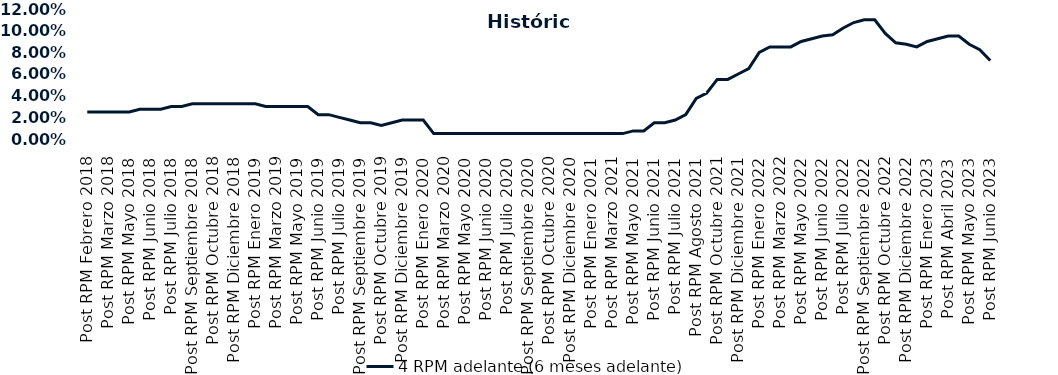
| Category | 4 RPM adelante (6 meses adelante) |
|---|---|
| Post RPM Febrero 2018 | 0.025 |
| Pre RPM Marzo 2018 | 0.025 |
| Post RPM Marzo 2018 | 0.025 |
| Pre RPM Mayo 2018 | 0.025 |
| Post RPM Mayo 2018 | 0.025 |
| Pre RPM Junio 2018 | 0.028 |
| Post RPM Junio 2018 | 0.028 |
| Pre RPM Julio 2018 | 0.028 |
| Post RPM Julio 2018 | 0.03 |
| Pre RPM Septiembre 2018 | 0.03 |
| Post RPM Septiembre 2018 | 0.032 |
| Pre RPM Octubre 2018 | 0.032 |
| Post RPM Octubre 2018 | 0.032 |
| Pre RPM Diciembre 2018 | 0.032 |
| Post RPM Diciembre 2018 | 0.032 |
| Pre RPM Enero 2019 | 0.032 |
| Post RPM Enero 2019 | 0.032 |
| Pre RPM Marzo 2019 | 0.03 |
| Post RPM Marzo 2019 | 0.03 |
| Pre RPM Mayo 2019 | 0.03 |
| Post RPM Mayo 2019 | 0.03 |
| Pre RPM Junio 2019 | 0.03 |
| Post RPM Junio 2019 | 0.022 |
| Pre RPM Julio 2019 | 0.022 |
| Post RPM Julio 2019 | 0.02 |
| Pre RPM Septiembre 2019 | 0.018 |
| Post RPM Septiembre 2019 | 0.015 |
| Pre RPM Octubre 2019 | 0.015 |
| Post RPM Octubre 2019 | 0.012 |
| Pre RPM Diciembre 2019 | 0.015 |
| Post RPM Diciembre 2019 | 0.018 |
| Pre RPM Enero 2020 | 0.018 |
| Post RPM Enero 2020 | 0.018 |
| Pre RPM Marzo 2020 | 0.005 |
| Post RPM Marzo 2020 | 0.005 |
| Pre RPM Mayo 2020 | 0.005 |
| Post RPM Mayo 2020 | 0.005 |
| Pre RPM Junio 2020 | 0.005 |
| Post RPM Junio 2020 | 0.005 |
| Pre RPM Julio 2020 | 0.005 |
| Post RPM Julio 2020 | 0.005 |
| Pre RPM Septiembre 2020 | 0.005 |
| Post RPM Septiembre 2020 | 0.005 |
| Pre RPM Octubre 2020 | 0.005 |
| Post RPM Octubre 2020 | 0.005 |
| Pre RPM Diciembre 2020 | 0.005 |
| Post RPM Diciembre 2020 | 0.005 |
| Pre RPM Enero 2021 | 0.005 |
| Post RPM Enero 2021 | 0.005 |
| Pre RPM Marzo 2021 | 0.005 |
| Post RPM Marzo 2021 | 0.005 |
| Pre RPM Mayo 2021 | 0.005 |
| Post RPM Mayo 2021 | 0.008 |
| Pre RPM Junio 2021 | 0.008 |
| Post RPM Junio 2021 | 0.015 |
| Pre RPM Julio 2021 | 0.015 |
| Post RPM Julio 2021 | 0.018 |
| Pre RPM Agosto 2021 | 0.022 |
| Post RPM Agosto 2021 | 0.038 |
| Pre RPM Octubre 2021 | 0.042 |
| Post RPM Octubre 2021 | 0.055 |
| Pre RPM Diciembre 2021 | 0.055 |
| Post RPM Diciembre 2021 | 0.06 |
| Pre RPM Enero 2022 | 0.065 |
| Post RPM Enero 2022 | 0.08 |
| Pre RPM Marzo 2022 | 0.085 |
| Post RPM Marzo 2022 | 0.085 |
| Pre RPM Mayo 2022 | 0.085 |
| Post RPM Mayo 2022 | 0.09 |
| Pre RPM Junio 2022 | 0.092 |
| Post RPM Junio 2022 | 0.095 |
| Pre RPM Julio 2022 | 0.096 |
| Post RPM Julio 2022 | 0.102 |
| Pre RPM Septiembre 2022 | 0.108 |
| Post RPM Septiembre 2022 | 0.11 |
| Pre RPM Octubre 2022 | 0.11 |
| Post RPM Octubre 2022 | 0.098 |
| Pre RPM Diciembre 2022 | 0.089 |
| Post RPM Diciembre 2022 | 0.088 |
| Pre RPM Enero 2023 | 0.085 |
| Post RPM Enero 2023 | 0.09 |
| Pre RPM Abril 2023 | 0.092 |
| Post RPM Abril 2023 | 0.095 |
| Pre RPM Mayo 2023 | 0.095 |
| Post RPM Mayo 2023 | 0.088 |
| Pre RPM Junio 2023 | 0.082 |
| Post RPM Junio 2023 | 0.072 |